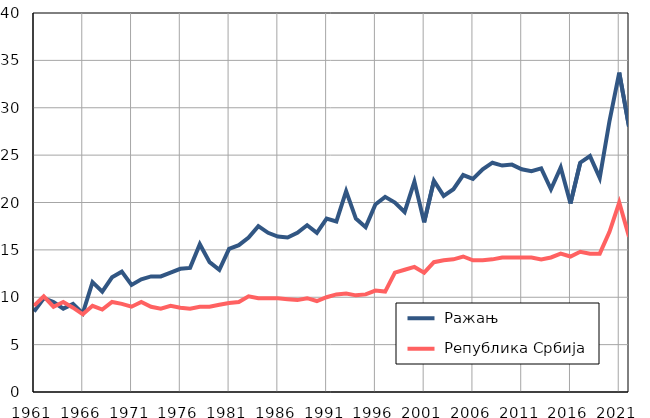
| Category |  Ражањ |  Република Србија |
|---|---|---|
| 1961.0 | 8.5 | 9.1 |
| 1962.0 | 9.9 | 10.1 |
| 1963.0 | 9.5 | 9 |
| 1964.0 | 8.8 | 9.5 |
| 1965.0 | 9.3 | 8.9 |
| 1966.0 | 8.3 | 8.2 |
| 1967.0 | 11.6 | 9.1 |
| 1968.0 | 10.6 | 8.7 |
| 1969.0 | 12.1 | 9.5 |
| 1970.0 | 12.7 | 9.3 |
| 1971.0 | 11.3 | 9 |
| 1972.0 | 11.9 | 9.5 |
| 1973.0 | 12.2 | 9 |
| 1974.0 | 12.2 | 8.8 |
| 1975.0 | 12.6 | 9.1 |
| 1976.0 | 13 | 8.9 |
| 1977.0 | 13.1 | 8.8 |
| 1978.0 | 15.6 | 9 |
| 1979.0 | 13.7 | 9 |
| 1980.0 | 12.9 | 9.2 |
| 1981.0 | 15.1 | 9.4 |
| 1982.0 | 15.5 | 9.5 |
| 1983.0 | 16.3 | 10.1 |
| 1984.0 | 17.5 | 9.9 |
| 1985.0 | 16.8 | 9.9 |
| 1986.0 | 16.4 | 9.9 |
| 1987.0 | 16.3 | 9.8 |
| 1988.0 | 16.8 | 9.7 |
| 1989.0 | 17.6 | 9.9 |
| 1990.0 | 16.8 | 9.6 |
| 1991.0 | 18.3 | 10 |
| 1992.0 | 18 | 10.3 |
| 1993.0 | 21.2 | 10.4 |
| 1994.0 | 18.3 | 10.2 |
| 1995.0 | 17.4 | 10.3 |
| 1996.0 | 19.8 | 10.7 |
| 1997.0 | 20.6 | 10.6 |
| 1998.0 | 20 | 12.6 |
| 1999.0 | 19 | 12.9 |
| 2000.0 | 22.2 | 13.2 |
| 2001.0 | 17.9 | 12.6 |
| 2002.0 | 22.3 | 13.7 |
| 2003.0 | 20.7 | 13.9 |
| 2004.0 | 21.4 | 14 |
| 2005.0 | 22.9 | 14.3 |
| 2006.0 | 22.5 | 13.9 |
| 2007.0 | 23.5 | 13.9 |
| 2008.0 | 24.2 | 14 |
| 2009.0 | 23.9 | 14.2 |
| 2010.0 | 24 | 14.2 |
| 2011.0 | 23.5 | 14.2 |
| 2012.0 | 23.3 | 14.2 |
| 2013.0 | 23.6 | 14 |
| 2014.0 | 21.4 | 14.2 |
| 2015.0 | 23.7 | 14.6 |
| 2016.0 | 19.9 | 14.3 |
| 2017.0 | 24.2 | 14.8 |
| 2018.0 | 24.9 | 14.6 |
| 2019.0 | 22.6 | 14.6 |
| 2020.0 | 28.6 | 16.9 |
| 2021.0 | 33.7 | 20 |
| 2022.0 | 28 | 16.4 |